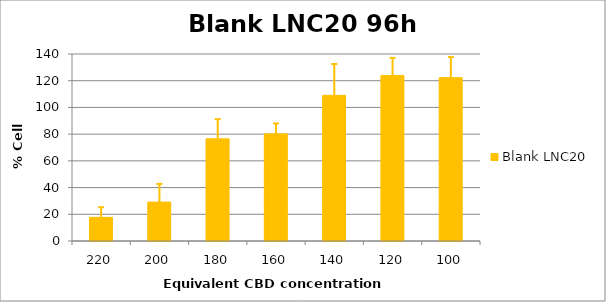
| Category | Blank LNC20 |
|---|---|
| 220.0 | 17.693 |
| 200.0 | 29.105 |
| 180.0 | 76.486 |
| 160.0 | 80.209 |
| 140.0 | 109.026 |
| 120.0 | 123.938 |
| 100.0 | 122.312 |